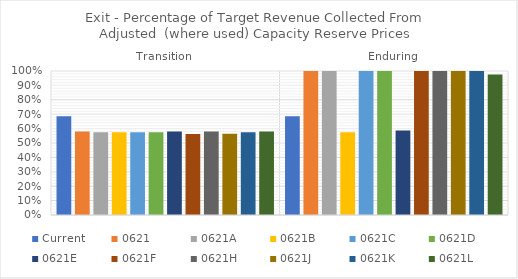
| Category | Current | 0621 | 0621A | 0621B | 0621C | 0621D | 0621E | 0621F | 0621H | 0621J | 0621K | 0621L |
|---|---|---|---|---|---|---|---|---|---|---|---|---|
| Transition | 0.686 | 0.58 | 0.575 | 0.575 | 0.575 | 0.575 | 0.58 | 0.562 | 0.58 | 0.564 | 0.575 | 0.58 |
| Enduring | 0.686 | 1 | 1 | 0.575 | 1 | 1 | 0.587 | 1 | 1 | 1 | 1 | 0.976 |